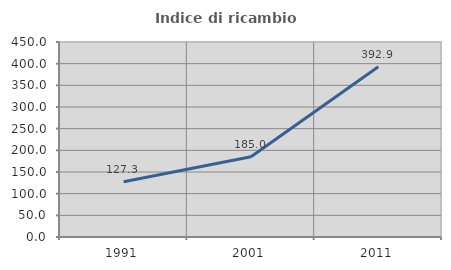
| Category | Indice di ricambio occupazionale  |
|---|---|
| 1991.0 | 127.278 |
| 2001.0 | 185.004 |
| 2011.0 | 392.889 |